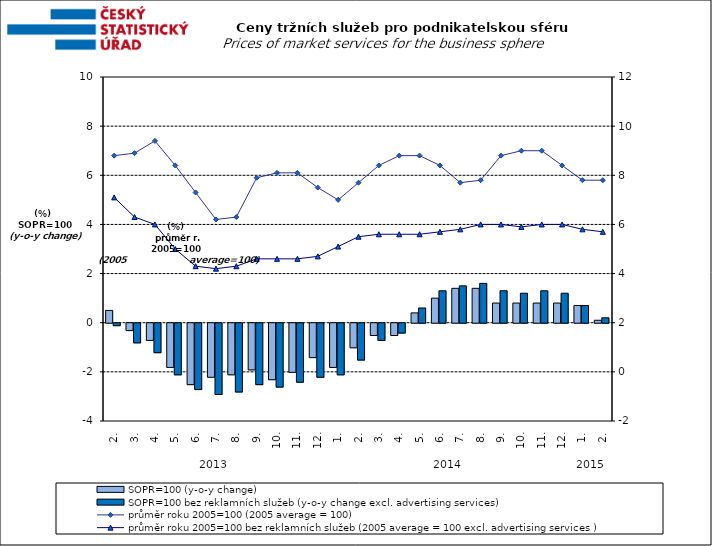
| Category | SOPR=100 (y-o-y change)   | SOPR=100 bez reklamních služeb (y-o-y change excl. advertising services)   |
|---|---|---|
| 0 | 0.5 | -0.1 |
| 1 | -0.3 | -0.8 |
| 2 | -0.7 | -1.2 |
| 3 | -1.8 | -2.1 |
| 4 | -2.5 | -2.7 |
| 5 | -2.2 | -2.9 |
| 6 | -2.1 | -2.8 |
| 7 | -1.9 | -2.5 |
| 8 | -2.3 | -2.6 |
| 9 | -2 | -2.4 |
| 10 | -1.4 | -2.2 |
| 11 | -1.8 | -2.1 |
| 12 | -1 | -1.5 |
| 13 | -0.5 | -0.7 |
| 14 | -0.5 | -0.4 |
| 15 | 0.4 | 0.6 |
| 16 | 1 | 1.3 |
| 17 | 1.4 | 1.5 |
| 18 | 1.4 | 1.6 |
| 19 | 0.8 | 1.3 |
| 20 | 0.8 | 1.2 |
| 21 | 0.8 | 1.3 |
| 22 | 0.8 | 1.2 |
| 23 | 0.7 | 0.7 |
| 24 | 0.1 | 0.2 |